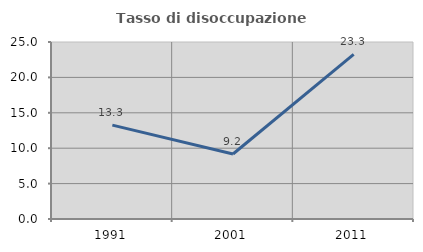
| Category | Tasso di disoccupazione giovanile  |
|---|---|
| 1991.0 | 13.255 |
| 2001.0 | 9.177 |
| 2011.0 | 23.251 |